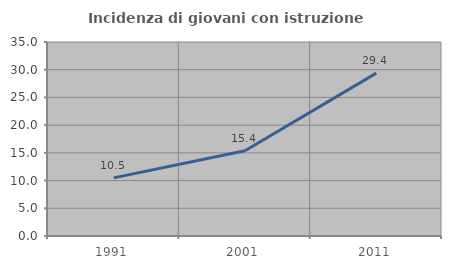
| Category | Incidenza di giovani con istruzione universitaria |
|---|---|
| 1991.0 | 10.486 |
| 2001.0 | 15.37 |
| 2011.0 | 29.379 |